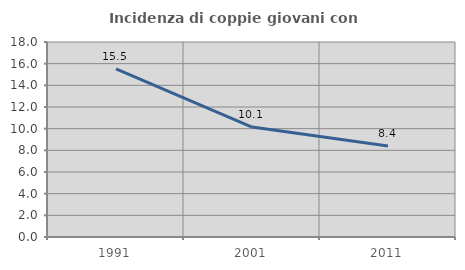
| Category | Incidenza di coppie giovani con figli |
|---|---|
| 1991.0 | 15.513 |
| 2001.0 | 10.147 |
| 2011.0 | 8.394 |